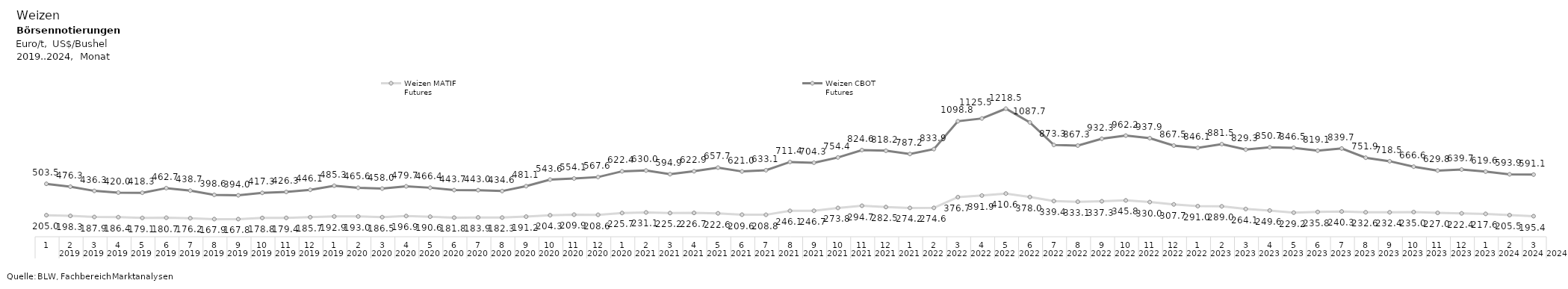
| Category | Weizen MATIF
Futures | Weizen CBOT
Futures |
|---|---|---|
| 0 | 195.429 | 591.107 |
| 1 | 205.488 | 593.881 |
| 2 | 217.576 | 619.62 |
| 3 | 222.44 | 639.655 |
| 4 | 226.966 | 629.784 |
| 5 | 234.977 | 666.648 |
| 6 | 232.393 | 718.5 |
| 7 | 232.641 | 751.924 |
| 8 | 240.262 | 839.679 |
| 9 | 235.795 | 819.136 |
| 10 | 229.239 | 846.489 |
| 11 | 249.575 | 850.725 |
| 12 | 264.076 | 829.272 |
| 13 | 289.012 | 881.525 |
| 14 | 290.955 | 846.114 |
| 15 | 307.67 | 867.477 |
| 16 | 329.966 | 937.943 |
| 17 | 345.75 | 962.214 |
| 18 | 337.3 | 932.262 |
| 19 | 333.119 | 867.25 |
| 20 | 339.369 | 873.262 |
| 21 | 377.989 | 1087.738 |
| 22 | 410.625 | 1218.548 |
| 23 | 391.921 | 1125.488 |
| 24 | 376.663 | 1098.815 |
| 25 | 274.638 | 833.882 |
| 26 | 274.238 | 787.214 |
| 27 | 282.511 | 818.179 |
| 28 | 294.727 | 824.643 |
| 29 | 273.821 | 754.357 |
| 30 | 246.716 | 704.333 |
| 31 | 246.125 | 711.443 |
| 32 | 208.784 | 633.095 |
| 33 | 209.631 | 621.024 |
| 34 | 222.631 | 657.712 |
| 35 | 226.675 | 622.869 |
| 36 | 225.174 | 594.891 |
| 37 | 231.1 | 629.974 |
| 38 | 225.712 | 622.434 |
| 39 | 208.58 | 567.648 |
| 40 | 209.94 | 554.138 |
| 41 | 204.284 | 543.568 |
| 42 | 191.17 | 481.131 |
| 43 | 182.274 | 434.56 |
| 44 | 183.88 | 443.034 |
| 45 | 181.761 | 443.716 |
| 46 | 190.562 | 466.4 |
| 47 | 196.925 | 479.679 |
| 48 | 186.466 | 458 |
| 49 | 192.988 | 465.645 |
| 50 | 192.886 | 485.262 |
| 51 | 185.7 | 446.095 |
| 52 | 179.369 | 426.288 |
| 53 | 178.826 | 417.337 |
| 54 | 167.821 | 393.988 |
| 55 | 167.875 | 398.568 |
| 56 | 176.239 | 438.739 |
| 57 | 180.65 | 462.675 |
| 58 | 179.125 | 418.25 |
| 59 | 186.388 | 420.036 |
| 60 | 187.929 | 436.274 |
| 61 | 198.275 | 476.329 |
| 62 | 204.955 | 503.464 |